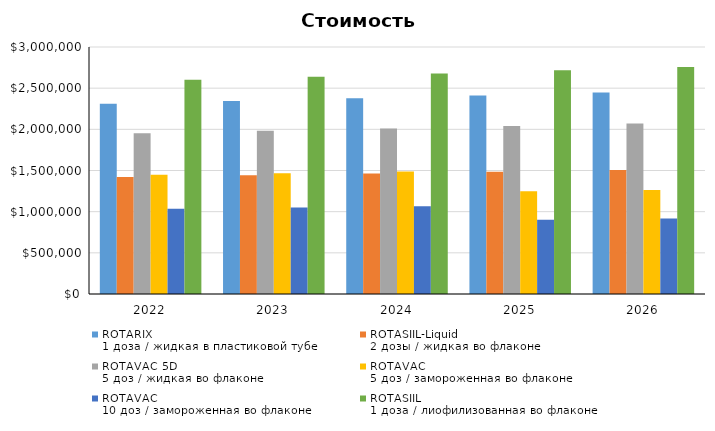
| Category | ROTARIX
1 доза / жидкая в пластиковой тубе | ROTASIIL-Liquid
2 дозы / жидкая во флаконе | ROTAVAC 5D
5 доз / жидкая во флаконе | ROTAVAC
5 доз / замороженная во флаконе | ROTAVAC
10 доз / замороженная во флаконе | ROTASIIL
1 доза / лиофилизованная во флаконе |
|---|---|---|---|---|---|---|
| 2022.0 | 2309679.167 | 1421921.538 | 1953628.421 | 1446975.789 | 1035545.106 | 2601897.5 |
| 2023.0 | 2343254.29 | 1442591.592 | 1982027.74 | 1468010.049 | 1050598.52 | 2639720.515 |
| 2024.0 | 2377317.485 | 1463562.119 | 2010839.891 | 1489350.077 | 1065870.76 | 2678093.352 |
| 2025.0 | 2411875.847 | 1484837.489 | 2040070.876 | 1246465.04 | 903132.019 | 2717024.003 |
| 2026.0 | 2446936.573 | 1506422.133 | 2069726.784 | 1264584.534 | 916260.582 | 2756520.578 |